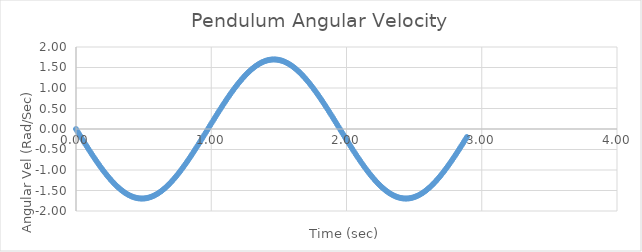
| Category | Series 0 |
|---|---|
| 0.0 | 0 |
| 0.01 | -0.054 |
| 0.02 | -0.107 |
| 0.03 | -0.161 |
| 0.04 | -0.214 |
| 0.05 | -0.267 |
| 0.060000000000000005 | -0.32 |
| 0.07 | -0.373 |
| 0.08 | -0.425 |
| 0.09 | -0.477 |
| 0.09999999999999999 | -0.528 |
| 0.10999999999999999 | -0.579 |
| 0.11999999999999998 | -0.63 |
| 0.12999999999999998 | -0.68 |
| 0.13999999999999999 | -0.729 |
| 0.15 | -0.777 |
| 0.16 | -0.825 |
| 0.17 | -0.872 |
| 0.18000000000000002 | -0.918 |
| 0.19000000000000003 | -0.963 |
| 0.20000000000000004 | -1.007 |
| 0.21000000000000005 | -1.05 |
| 0.22000000000000006 | -1.093 |
| 0.23000000000000007 | -1.134 |
| 0.24000000000000007 | -1.174 |
| 0.25000000000000006 | -1.212 |
| 0.26000000000000006 | -1.25 |
| 0.2700000000000001 | -1.286 |
| 0.2800000000000001 | -1.321 |
| 0.2900000000000001 | -1.355 |
| 0.3000000000000001 | -1.387 |
| 0.3100000000000001 | -1.418 |
| 0.3200000000000001 | -1.448 |
| 0.3300000000000001 | -1.476 |
| 0.34000000000000014 | -1.502 |
| 0.35000000000000014 | -1.527 |
| 0.36000000000000015 | -1.55 |
| 0.37000000000000016 | -1.572 |
| 0.38000000000000017 | -1.592 |
| 0.3900000000000002 | -1.61 |
| 0.4000000000000002 | -1.627 |
| 0.4100000000000002 | -1.641 |
| 0.4200000000000002 | -1.654 |
| 0.4300000000000002 | -1.666 |
| 0.4400000000000002 | -1.675 |
| 0.45000000000000023 | -1.683 |
| 0.46000000000000024 | -1.689 |
| 0.47000000000000025 | -1.693 |
| 0.48000000000000026 | -1.696 |
| 0.49000000000000027 | -1.696 |
| 0.5000000000000002 | -1.695 |
| 0.5100000000000002 | -1.692 |
| 0.5200000000000002 | -1.687 |
| 0.5300000000000002 | -1.68 |
| 0.5400000000000003 | -1.671 |
| 0.5500000000000003 | -1.661 |
| 0.5600000000000003 | -1.649 |
| 0.5700000000000003 | -1.635 |
| 0.5800000000000003 | -1.619 |
| 0.5900000000000003 | -1.602 |
| 0.6000000000000003 | -1.583 |
| 0.6100000000000003 | -1.562 |
| 0.6200000000000003 | -1.54 |
| 0.6300000000000003 | -1.516 |
| 0.6400000000000003 | -1.491 |
| 0.6500000000000004 | -1.464 |
| 0.6600000000000004 | -1.435 |
| 0.6700000000000004 | -1.405 |
| 0.6800000000000004 | -1.373 |
| 0.6900000000000004 | -1.34 |
| 0.7000000000000004 | -1.306 |
| 0.7100000000000004 | -1.27 |
| 0.7200000000000004 | -1.234 |
| 0.7300000000000004 | -1.195 |
| 0.7400000000000004 | -1.156 |
| 0.7500000000000004 | -1.116 |
| 0.7600000000000005 | -1.074 |
| 0.7700000000000005 | -1.031 |
| 0.7800000000000005 | -0.988 |
| 0.7900000000000005 | -0.943 |
| 0.8000000000000005 | -0.897 |
| 0.8100000000000005 | -0.851 |
| 0.8200000000000005 | -0.804 |
| 0.8300000000000005 | -0.756 |
| 0.8400000000000005 | -0.707 |
| 0.8500000000000005 | -0.658 |
| 0.8600000000000005 | -0.608 |
| 0.8700000000000006 | -0.557 |
| 0.8800000000000006 | -0.506 |
| 0.8900000000000006 | -0.454 |
| 0.9000000000000006 | -0.402 |
| 0.9100000000000006 | -0.35 |
| 0.9200000000000006 | -0.297 |
| 0.9300000000000006 | -0.244 |
| 0.9400000000000006 | -0.191 |
| 0.9500000000000006 | -0.137 |
| 0.9600000000000006 | -0.084 |
| 0.9700000000000006 | -0.03 |
| 0.9800000000000006 | 0.024 |
| 0.9900000000000007 | 0.077 |
| 1.0000000000000007 | 0.131 |
| 1.0100000000000007 | 0.184 |
| 1.0200000000000007 | 0.238 |
| 1.0300000000000007 | 0.291 |
| 1.0400000000000007 | 0.344 |
| 1.0500000000000007 | 0.396 |
| 1.0600000000000007 | 0.448 |
| 1.0700000000000007 | 0.5 |
| 1.0800000000000007 | 0.551 |
| 1.0900000000000007 | 0.602 |
| 1.1000000000000008 | 0.652 |
| 1.1100000000000008 | 0.701 |
| 1.1200000000000008 | 0.75 |
| 1.1300000000000008 | 0.798 |
| 1.1400000000000008 | 0.846 |
| 1.1500000000000008 | 0.892 |
| 1.1600000000000008 | 0.938 |
| 1.1700000000000008 | 0.983 |
| 1.1800000000000008 | 1.026 |
| 1.1900000000000008 | 1.069 |
| 1.2000000000000008 | 1.111 |
| 1.2100000000000009 | 1.151 |
| 1.2200000000000009 | 1.191 |
| 1.2300000000000009 | 1.229 |
| 1.2400000000000009 | 1.266 |
| 1.2500000000000009 | 1.302 |
| 1.260000000000001 | 1.336 |
| 1.270000000000001 | 1.37 |
| 1.280000000000001 | 1.401 |
| 1.290000000000001 | 1.432 |
| 1.300000000000001 | 1.46 |
| 1.310000000000001 | 1.488 |
| 1.320000000000001 | 1.513 |
| 1.330000000000001 | 1.537 |
| 1.340000000000001 | 1.56 |
| 1.350000000000001 | 1.581 |
| 1.360000000000001 | 1.6 |
| 1.370000000000001 | 1.618 |
| 1.380000000000001 | 1.633 |
| 1.390000000000001 | 1.647 |
| 1.400000000000001 | 1.66 |
| 1.410000000000001 | 1.67 |
| 1.420000000000001 | 1.679 |
| 1.430000000000001 | 1.686 |
| 1.440000000000001 | 1.691 |
| 1.450000000000001 | 1.694 |
| 1.460000000000001 | 1.696 |
| 1.470000000000001 | 1.696 |
| 1.480000000000001 | 1.694 |
| 1.490000000000001 | 1.69 |
| 1.500000000000001 | 1.684 |
| 1.5100000000000011 | 1.676 |
| 1.5200000000000011 | 1.667 |
| 1.5300000000000011 | 1.656 |
| 1.5400000000000011 | 1.643 |
| 1.5500000000000012 | 1.628 |
| 1.5600000000000012 | 1.612 |
| 1.5700000000000012 | 1.594 |
| 1.5800000000000012 | 1.574 |
| 1.5900000000000012 | 1.553 |
| 1.6000000000000012 | 1.53 |
| 1.6100000000000012 | 1.505 |
| 1.6200000000000012 | 1.479 |
| 1.6300000000000012 | 1.451 |
| 1.6400000000000012 | 1.422 |
| 1.6500000000000012 | 1.391 |
| 1.6600000000000013 | 1.359 |
| 1.6700000000000013 | 1.325 |
| 1.6800000000000013 | 1.29 |
| 1.6900000000000013 | 1.254 |
| 1.7000000000000013 | 1.217 |
| 1.7100000000000013 | 1.178 |
| 1.7200000000000013 | 1.138 |
| 1.7300000000000013 | 1.097 |
| 1.7400000000000013 | 1.055 |
| 1.7500000000000013 | 1.012 |
| 1.7600000000000013 | 0.968 |
| 1.7700000000000014 | 0.923 |
| 1.7800000000000014 | 0.877 |
| 1.7900000000000014 | 0.83 |
| 1.8000000000000014 | 0.783 |
| 1.8100000000000014 | 0.734 |
| 1.8200000000000014 | 0.685 |
| 1.8300000000000014 | 0.636 |
| 1.8400000000000014 | 0.585 |
| 1.8500000000000014 | 0.534 |
| 1.8600000000000014 | 0.483 |
| 1.8700000000000014 | 0.431 |
| 1.8800000000000014 | 0.379 |
| 1.8900000000000015 | 0.326 |
| 1.9000000000000015 | 0.273 |
| 1.9100000000000015 | 0.22 |
| 1.9200000000000015 | 0.167 |
| 1.9300000000000015 | 0.113 |
| 1.9400000000000015 | 0.06 |
| 1.9500000000000015 | 0.006 |
| 1.9600000000000015 | -0.047 |
| 1.9700000000000015 | -0.101 |
| 1.9800000000000015 | -0.155 |
| 1.9900000000000015 | -0.208 |
| 2.0000000000000013 | -0.261 |
| 2.010000000000001 | -0.314 |
| 2.020000000000001 | -0.367 |
| 2.0300000000000007 | -0.419 |
| 2.0400000000000005 | -0.471 |
| 2.0500000000000003 | -0.523 |
| 2.06 | -0.574 |
| 2.07 | -0.624 |
| 2.0799999999999996 | -0.674 |
| 2.0899999999999994 | -0.723 |
| 2.099999999999999 | -0.772 |
| 2.109999999999999 | -0.819 |
| 2.1199999999999988 | -0.866 |
| 2.1299999999999986 | -0.912 |
| 2.1399999999999983 | -0.958 |
| 2.149999999999998 | -1.002 |
| 2.159999999999998 | -1.045 |
| 2.1699999999999977 | -1.088 |
| 2.1799999999999975 | -1.129 |
| 2.1899999999999973 | -1.169 |
| 2.199999999999997 | -1.208 |
| 2.209999999999997 | -1.246 |
| 2.2199999999999966 | -1.282 |
| 2.2299999999999964 | -1.317 |
| 2.239999999999996 | -1.351 |
| 2.249999999999996 | -1.384 |
| 2.259999999999996 | -1.415 |
| 2.2699999999999956 | -1.444 |
| 2.2799999999999954 | -1.473 |
| 2.289999999999995 | -1.499 |
| 2.299999999999995 | -1.524 |
| 2.3099999999999947 | -1.548 |
| 2.3199999999999945 | -1.569 |
| 2.3299999999999943 | -1.589 |
| 2.339999999999994 | -1.608 |
| 2.349999999999994 | -1.625 |
| 2.3599999999999937 | -1.64 |
| 2.3699999999999934 | -1.653 |
| 2.3799999999999932 | -1.665 |
| 2.389999999999993 | -1.674 |
| 2.399999999999993 | -1.682 |
| 2.4099999999999926 | -1.688 |
| 2.4199999999999924 | -1.693 |
| 2.429999999999992 | -1.695 |
| 2.439999999999992 | -1.696 |
| 2.4499999999999917 | -1.695 |
| 2.4599999999999915 | -1.692 |
| 2.4699999999999913 | -1.687 |
| 2.479999999999991 | -1.681 |
| 2.489999999999991 | -1.672 |
| 2.4999999999999907 | -1.662 |
| 2.5099999999999905 | -1.65 |
| 2.5199999999999902 | -1.637 |
| 2.52999999999999 | -1.621 |
| 2.53999999999999 | -1.604 |
| 2.5499999999999896 | -1.585 |
| 2.5599999999999894 | -1.565 |
| 2.569999999999989 | -1.543 |
| 2.579999999999989 | -1.519 |
| 2.5899999999999888 | -1.494 |
| 2.5999999999999885 | -1.467 |
| 2.6099999999999883 | -1.438 |
| 2.619999999999988 | -1.408 |
| 2.629999999999988 | -1.377 |
| 2.6399999999999877 | -1.344 |
| 2.6499999999999875 | -1.31 |
| 2.6599999999999873 | -1.275 |
| 2.669999999999987 | -1.238 |
| 2.679999999999987 | -1.2 |
| 2.6899999999999866 | -1.161 |
| 2.6999999999999864 | -1.12 |
| 2.709999999999986 | -1.079 |
| 2.719999999999986 | -1.036 |
| 2.7299999999999858 | -0.993 |
| 2.7399999999999856 | -0.948 |
| 2.7499999999999853 | -0.903 |
| 2.759999999999985 | -0.856 |
| 2.769999999999985 | -0.809 |
| 2.7799999999999847 | -0.761 |
| 2.7899999999999845 | -0.713 |
| 2.7999999999999843 | -0.663 |
| 2.809999999999984 | -0.613 |
| 2.819999999999984 | -0.563 |
| 2.8299999999999836 | -0.512 |
| 2.8399999999999834 | -0.46 |
| 2.849999999999983 | -0.408 |
| 2.859999999999983 | -0.356 |
| 2.869999999999983 | -0.303 |
| 2.8799999999999826 | -0.25 |
| 2.8899999999999824 | -0.197 |